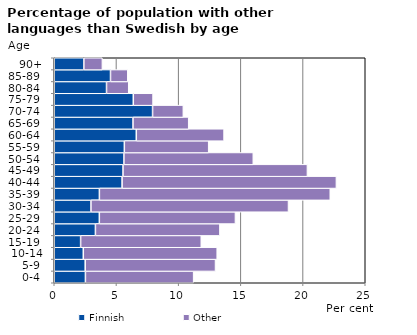
| Category | Finnish | Other |
|---|---|---|
|   0-4  | 2.505 | 8.699 |
|   5-9  | 2.488 | 10.475 |
| 10-14 | 2.335 | 10.763 |
| 15-19  | 2.121 | 9.697 |
| 20-24  | 3.309 | 10.008 |
| 25-29  | 3.624 | 10.941 |
| 30-34  | 2.952 | 15.878 |
| 35-39  | 3.628 | 18.559 |
| 40-44  | 5.454 | 17.227 |
| 45-49  | 5.527 | 14.824 |
| 50-54  | 5.6 | 10.4 |
| 55-59  | 5.634 | 6.78 |
| 60-64  | 6.595 | 7.055 |
| 65-69  | 6.33 | 4.478 |
| 70-74  | 7.903 | 2.473 |
| 75-79  | 6.353 | 1.588 |
| 80-84  | 4.202 | 1.786 |
| 85-89  | 4.522 | 1.391 |
| 90+ | 2.381 | 1.488 |